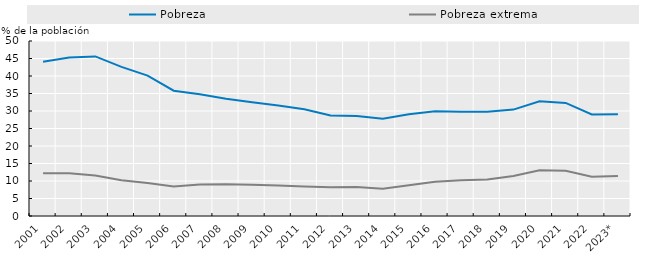
| Category | Pobreza | Pobreza extrema |
|---|---|---|
| 2001 | 44.1 | 12.2 |
| 2002 | 45.3 | 12.2 |
| 2003 | 45.6 | 11.6 |
| 2004 | 42.6 | 10.2 |
| 2005 | 40.1 | 9.4 |
| 2006 | 35.8 | 8.4 |
| 2007 | 34.8 | 9 |
| 2008 | 33.5 | 9.1 |
| 2009 | 32.5 | 8.9 |
| 2010 | 31.6 | 8.7 |
| 2011 | 30.5 | 8.4 |
| 2012 | 28.7 | 8.2 |
| 2013 | 28.6 | 8.3 |
| 2014 | 27.8 | 7.8 |
| 2015 | 29.1 | 8.8 |
| 2016 | 29.9 | 9.8 |
| 2017 | 29.8 | 10.2 |
| 2018 | 29.8 | 10.4 |
| 2019 | 30.4 | 11.4 |
| 2020 | 32.8 | 13.1 |
| 2021 | 32.3 | 12.9 |
| 2022 | 29 | 11.2 |
| 2023* | 29.1 | 11.4 |